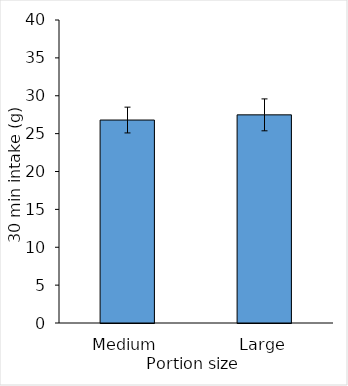
| Category | Series 0 |
|---|---|
| Medium | 26.794 |
| Large | 27.478 |